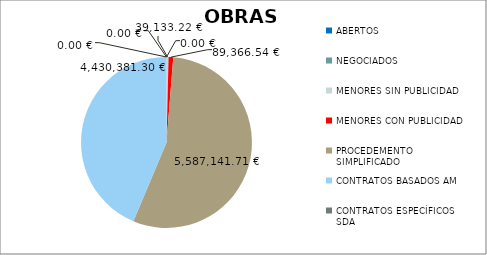
| Category | Series 0 |
|---|---|
| ABERTOS  | 0 |
| NEGOCIADOS  | 0 |
| MENORES SIN PUBLICIDAD | 39133.22 |
| MENORES CON PUBLICIDAD | 89366.54 |
| PROCEDEMENTO SIMPLIFICADO | 5587141.71 |
| CONTRATOS BASADOS AM | 4430381.3 |
| CONTRATOS ESPECÍFICOS SDA | 0 |